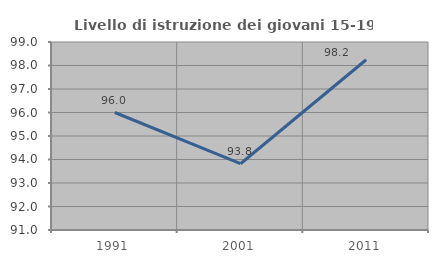
| Category | Livello di istruzione dei giovani 15-19 anni |
|---|---|
| 1991.0 | 96 |
| 2001.0 | 93.82 |
| 2011.0 | 98.246 |